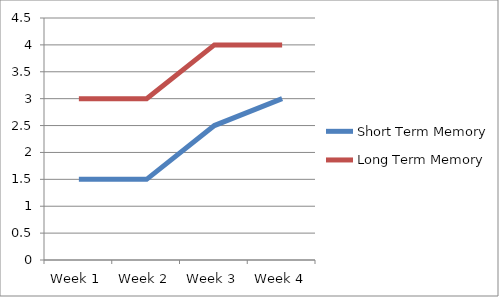
| Category | Short Term Memory | Long Term Memory |
|---|---|---|
| Week 1 | 1.5 | 3 |
| Week 2 | 1.5 | 3 |
| Week 3 | 2.5 | 4 |
| Week 4 | 3 | 4 |